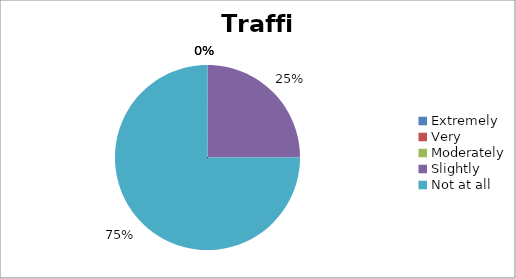
| Category | Traffic |
|---|---|
| Extremely | 0 |
| Very | 0 |
| Moderately | 0 |
| Slightly | 1 |
| Not at all | 3 |